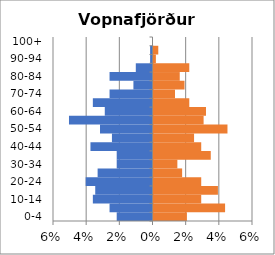
| Category | % Men | % Women |
|---|---|---|
| 0-4 | -0.022 | 0.02 |
| 5-9 | -0.026 | 0.043 |
| 10-14 | -0.036 | 0.029 |
| 15-19 | -0.035 | 0.039 |
| 20-24 | -0.04 | 0.029 |
| 25-29 | -0.033 | 0.017 |
| 30-34 | -0.022 | 0.014 |
| 35-39 | -0.022 | 0.035 |
| 40-44 | -0.037 | 0.029 |
| 45-49 | -0.024 | 0.024 |
| 50-54 | -0.032 | 0.045 |
| 55-59 | -0.05 | 0.03 |
| 60-64 | -0.029 | 0.032 |
| 65-69 | -0.036 | 0.022 |
| 70-74 | -0.026 | 0.013 |
| 75-79 | -0.012 | 0.019 |
| 80-84 | -0.026 | 0.016 |
| 85-89 | -0.01 | 0.022 |
| 90-94 | -0.001 | 0.001 |
| 95-99 | -0.001 | 0.003 |
| 100+ | 0 | 0 |